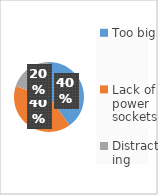
| Category | Series 0 |
|---|---|
| Too big | 2 |
| Lack of power sockets | 2 |
| Distracting | 1 |